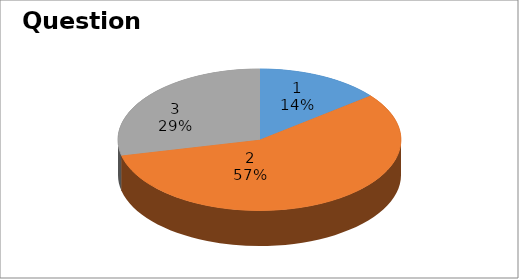
| Category | Series 0 |
|---|---|
| 0 | 2 |
| 1 | 8 |
| 2 | 4 |